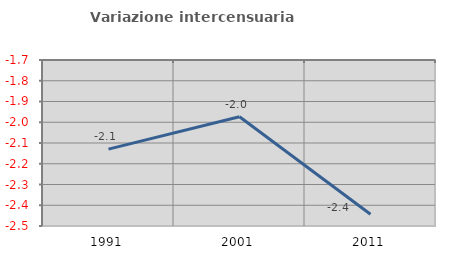
| Category | Variazione intercensuaria annua |
|---|---|
| 1991.0 | -2.13 |
| 2001.0 | -1.973 |
| 2011.0 | -2.444 |